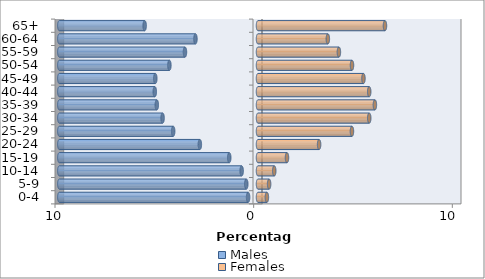
| Category | Males | Females |
|---|---|---|
| 0-4 | -0.498 | 0.448 |
| 5-9 | -0.59 | 0.559 |
| 10-14 | -0.823 | 0.819 |
| 15-19 | -1.448 | 1.459 |
| 20-24 | -2.927 | 3.076 |
| 25-29 | -4.27 | 4.729 |
| 30-34 | -4.804 | 5.599 |
| 35-39 | -5.094 | 5.884 |
| 40-44 | -5.195 | 5.598 |
| 45-49 | -5.17 | 5.308 |
| 50-54 | -4.46 | 4.731 |
| 55-59 | -3.677 | 4.072 |
| 60-64 | -3.149 | 3.516 |
| 65+ | -5.706 | 6.391 |